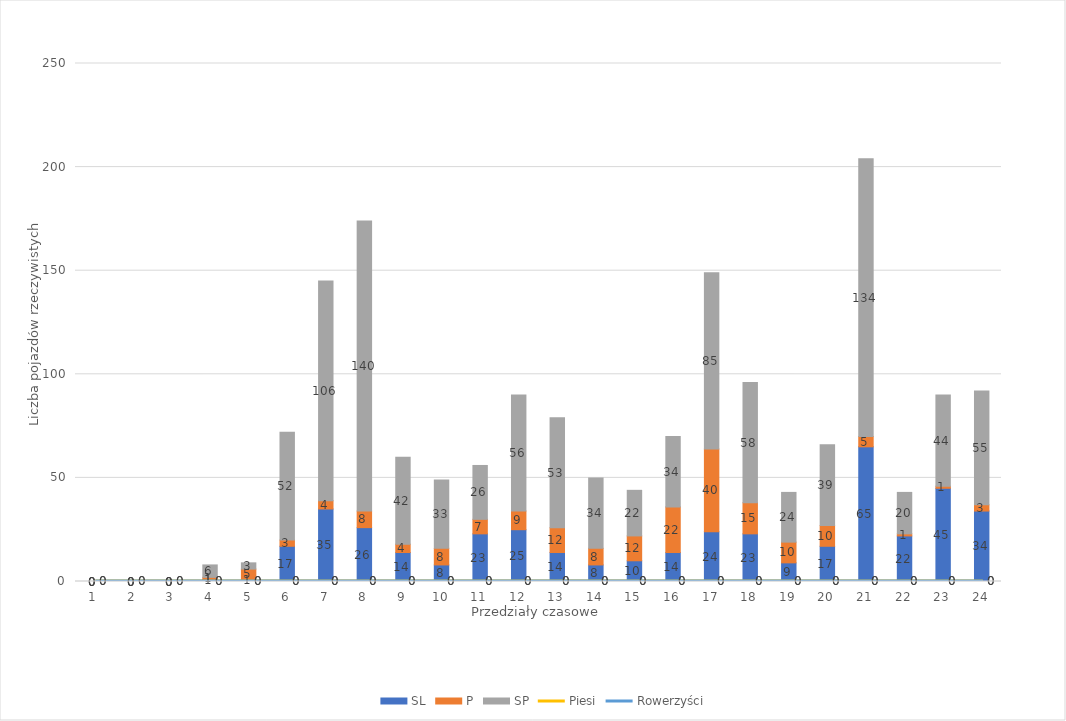
| Category | SL | P | SP |
|---|---|---|---|
| 0 | 0 | 0 | 0 |
| 1 | 0 | 0 | 0 |
| 2 | 0 | 0 | 0 |
| 3 | 1 | 1 | 6 |
| 4 | 1 | 5 | 3 |
| 5 | 17 | 3 | 52 |
| 6 | 35 | 4 | 106 |
| 7 | 26 | 8 | 140 |
| 8 | 14 | 4 | 42 |
| 9 | 8 | 8 | 33 |
| 10 | 23 | 7 | 26 |
| 11 | 25 | 9 | 56 |
| 12 | 14 | 12 | 53 |
| 13 | 8 | 8 | 34 |
| 14 | 10 | 12 | 22 |
| 15 | 14 | 22 | 34 |
| 16 | 24 | 40 | 85 |
| 17 | 23 | 15 | 58 |
| 18 | 9 | 10 | 24 |
| 19 | 17 | 10 | 39 |
| 20 | 65 | 5 | 134 |
| 21 | 22 | 1 | 20 |
| 22 | 45 | 1 | 44 |
| 23 | 34 | 3 | 55 |